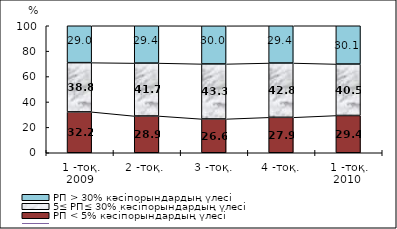
| Category | РП < 5% кәсіпорындардың үлесі | 5≤ РП≤ 30% кәсіпорындардың үлесі | РП > 30% кәсіпорындардың үлесі |
|---|---|---|---|
| 1 -тоқ. 2009 | 32.182 | 38.779 | 29.038 |
| 2 -тоқ.  | 28.94 | 41.662 | 29.398 |
| 3 -тоқ. | 26.634 | 43.301 | 30.011 |
| 4 -тоқ. | 27.894 | 42.753 | 29.353 |
| 1 -тоқ. 2010  | 29.353 | 40.505 | 30.142 |